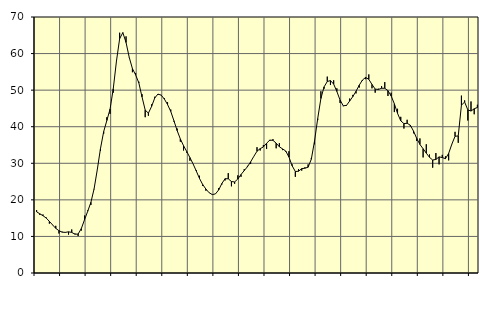
| Category | Piggar | Series 1 |
|---|---|---|
| nan | 17.2 | 16.74 |
| 87.0 | 15.9 | 16.19 |
| 87.0 | 16 | 15.67 |
| 87.0 | 15.2 | 15.03 |
| nan | 13.5 | 14.12 |
| 88.0 | 13.1 | 13.16 |
| 88.0 | 12.9 | 12.21 |
| 88.0 | 10.8 | 11.57 |
| nan | 11.3 | 11.16 |
| 89.0 | 11.2 | 11.11 |
| 89.0 | 10.5 | 11.26 |
| 89.0 | 11.9 | 11.1 |
| nan | 10.8 | 10.61 |
| 90.0 | 10.1 | 10.65 |
| 90.0 | 11.6 | 12.15 |
| 90.0 | 15.7 | 14.55 |
| nan | 17.1 | 16.88 |
| 91.0 | 18.6 | 19.32 |
| 91.0 | 22.9 | 23 |
| 91.0 | 28.3 | 28.25 |
| nan | 33.4 | 34.02 |
| 92.0 | 38.1 | 38.66 |
| 92.0 | 42.6 | 41.72 |
| 92.0 | 43.5 | 44.8 |
| nan | 49.3 | 50.37 |
| 93.0 | 58 | 57.94 |
| 93.0 | 65.7 | 64.07 |
| 93.0 | 65.6 | 65.72 |
| nan | 64.7 | 63.04 |
| 94.0 | 58.9 | 58.97 |
| 94.0 | 54.9 | 55.88 |
| 94.0 | 54.7 | 54.17 |
| nan | 52.3 | 52 |
| 95.0 | 48.9 | 48.16 |
| 95.0 | 42.6 | 44.56 |
| 95.0 | 43 | 43.71 |
| nan | 46.1 | 45.54 |
| 96.0 | 48.2 | 47.88 |
| 96.0 | 48.7 | 48.92 |
| 96.0 | 48.7 | 48.63 |
| nan | 47.8 | 47.56 |
| 97.0 | 46.7 | 46.06 |
| 97.0 | 44.7 | 44.18 |
| 97.0 | 41.4 | 41.62 |
| nan | 39.5 | 38.94 |
| 98.0 | 35.9 | 36.66 |
| 98.0 | 33.5 | 34.81 |
| 98.0 | 32.9 | 33.23 |
| nan | 30.7 | 31.56 |
| 99.0 | 29.8 | 29.81 |
| 99.0 | 28.1 | 27.87 |
| 99.0 | 26.6 | 25.85 |
| nan | 23.8 | 24.19 |
| 0.0 | 22.5 | 22.96 |
| 0.0 | 22 | 21.96 |
| 0.0 | 21.4 | 21.44 |
| nan | 21.6 | 21.63 |
| 1.0 | 23.2 | 22.71 |
| 1.0 | 24.2 | 24.47 |
| 1.0 | 25.3 | 25.78 |
| nan | 27.3 | 25.76 |
| 2.0 | 23.7 | 25.01 |
| 2.0 | 24.4 | 24.9 |
| 2.0 | 26.7 | 25.7 |
| nan | 26.3 | 26.93 |
| 3.0 | 28.4 | 28 |
| 3.0 | 29.3 | 29.04 |
| 3.0 | 29.8 | 30.39 |
| nan | 31.9 | 31.88 |
| 4.0 | 34.4 | 33.3 |
| 4.0 | 33.5 | 34.01 |
| 4.0 | 35 | 34.47 |
| nan | 33.9 | 35.48 |
| 5.0 | 36.1 | 36.34 |
| 5.0 | 36.6 | 36.27 |
| 5.0 | 34.1 | 35.5 |
| nan | 35.5 | 34.52 |
| 6.0 | 33.6 | 33.93 |
| 6.0 | 33.2 | 33.36 |
| 6.0 | 33.3 | 31.71 |
| nan | 29.7 | 29.33 |
| 7.0 | 26.3 | 27.75 |
| 7.0 | 28.4 | 27.83 |
| 7.0 | 28 | 28.53 |
| nan | 28.9 | 28.65 |
| 8.0 | 29.7 | 28.93 |
| 8.0 | 31.4 | 31.1 |
| 8.0 | 35.2 | 36.01 |
| nan | 41.8 | 42.21 |
| 9.0 | 49.7 | 47.71 |
| 9.0 | 50.4 | 50.9 |
| 9.0 | 53.7 | 52.36 |
| nan | 51.4 | 52.61 |
| 10.0 | 52.7 | 51.65 |
| 10.0 | 50.5 | 49.65 |
| 10.0 | 46.5 | 47.29 |
| nan | 45.6 | 45.73 |
| 11.0 | 45.7 | 45.82 |
| 11.0 | 47.7 | 47.01 |
| 11.0 | 48.7 | 48.24 |
| nan | 49.1 | 49.69 |
| 12.0 | 50.7 | 51.35 |
| 12.0 | 52.5 | 52.75 |
| 12.0 | 53 | 53.47 |
| nan | 54.3 | 52.96 |
| 13.0 | 50.5 | 51.56 |
| 13.0 | 49.3 | 50.29 |
| 13.0 | 50.4 | 50.18 |
| nan | 51.1 | 50.51 |
| 14.0 | 52.2 | 50.51 |
| 14.0 | 48.4 | 49.86 |
| 14.0 | 49.3 | 48.4 |
| nan | 44 | 46.27 |
| 15.0 | 44.9 | 43.66 |
| 15.0 | 42.7 | 41.61 |
| 15.0 | 39.5 | 40.85 |
| nan | 41.9 | 40.94 |
| 16.0 | 40.1 | 40.41 |
| 16.0 | 38.2 | 38.8 |
| 16.0 | 36.1 | 36.81 |
| nan | 36.8 | 35.16 |
| 17.0 | 31.6 | 33.97 |
| 17.0 | 35.2 | 32.78 |
| 17.0 | 32.4 | 31.63 |
| nan | 28.8 | 30.89 |
| 18.0 | 32.8 | 31.05 |
| 18.0 | 29.7 | 31.75 |
| 18.0 | 32.3 | 31.57 |
| nan | 31.9 | 31.26 |
| 19.0 | 30.8 | 32.7 |
| 19.0 | 35.2 | 35.23 |
| 19.0 | 38.6 | 37.38 |
| nan | 35.6 | 37.48 |
| 20.0 | 48.5 | 45.9 |
| 20.0 | 47.2 | 46.75 |
| 20.0 | 41.7 | 44.6 |
| nan | 46.9 | 44.28 |
| 21.0 | 43.4 | 44.91 |
| 21.0 | 46 | 45.26 |